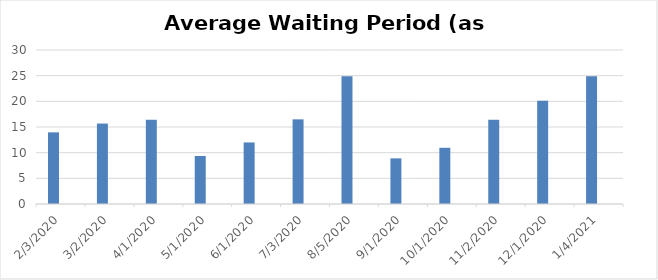
| Category | Current | Series 1 |
|---|---|---|
| 2/3/20 | 13.96 |  |
| 3/2/20 | 15.67 |  |
| 4/1/20 | 16.41 |  |
| 5/1/20 | 9.35 |  |
| 6/1/20 | 11.99 |  |
| 7/3/20 | 16.49 |  |
| 8/5/20 | 24.91 |  |
| 9/1/20 | 8.89 |  |
| 10/1/20 | 10.95 |  |
| 11/2/20 | 16.41 |  |
| 12/1/20 | 20.1 |  |
| 1/4/21 | 24.91 |  |